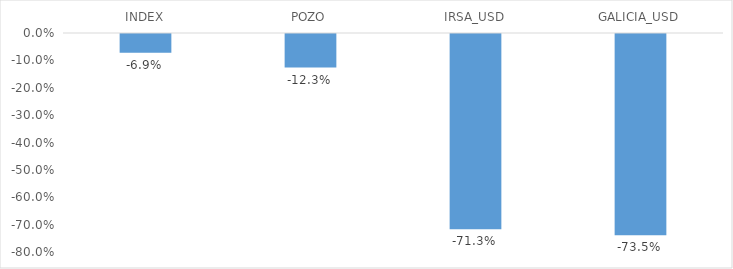
| Category | Series 0 |
|---|---|
| INDEX | -0.069 |
| POZO | -0.123 |
| IRSA_USD | -0.713 |
| GALICIA_USD | -0.735 |